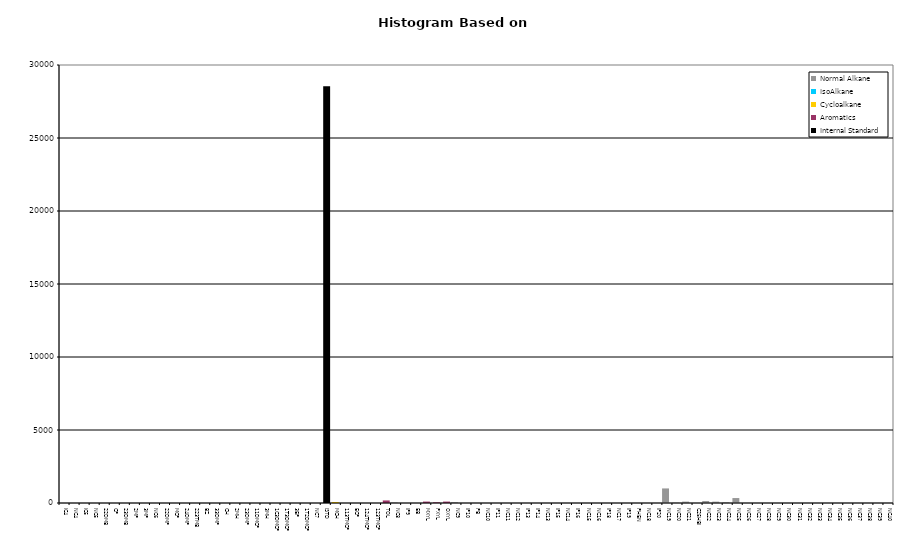
| Category | Normal Alkane | IsoAlkane | Cycloalkane | Aromatics | Internal Standard |
|---|---|---|---|---|---|
| IC4 | 0 | 0 | 0 | 0 | 0 |
| NC4 | 0 | 0 | 0 | 0 | 0 |
| IC5 | 0 | 0 | 0 | 0 | 0 |
| NC5 | 0 | 0 | 0 | 0 | 0 |
| 22DMB | 0 | 0 | 0 | 0 | 0 |
| CP | 0 | 0 | 0 | 0 | 0 |
| 23DMB | 0 | 0 | 0 | 0 | 0 |
| 2MP | 0 | 0 | 0 | 0 | 0 |
| 3MP | 0 | 0 | 0 | 0 | 0 |
| NC6 | 0 | 0 | 0 | 0 | 0 |
| 22DMP | 0 | 0 | 0 | 0 | 0 |
| MCP | 0 | 0 | 0 | 0 | 0 |
| 24DMP | 0 | 0 | 0 | 0 | 0 |
| 223TMB | 0 | 0 | 0 | 0 | 0 |
| BZ | 0 | 0 | 0 | 0 | 0 |
| 33DMP | 0 | 0 | 0 | 0 | 0 |
| CH | 0 | 0 | 0 | 0 | 0 |
| 2MH | 0 | 0 | 0 | 0 | 0 |
| 23DMP | 0 | 0 | 0 | 0 | 0 |
| 11DMCP | 0 | 0 | 0 | 0 | 0 |
| 3MH | 0 | 0 | 0 | 0 | 0 |
| 1C3DMCP | 0 | 0 | 0 | 0 | 0 |
| 1T3DMCP | 0 | 0 | 0 | 0 | 0 |
| 3EP | 0 | 0 | 0 | 0 | 0 |
| 1T2DMCP | 0 | 0 | 0 | 0 | 0 |
| NC7 | 0 | 0 | 0 | 0 | 0 |
| ISTD | 0 | 0 | 0 | 0 | 28540 |
| MCH | 0 | 0 | 67 | 0 | 0 |
| 113TMCP | 0 | 0 | 0 | 0 | 0 |
| ECP | 0 | 0 | 0 | 0 | 0 |
| 124TMCP | 0 | 0 | 0 | 0 | 0 |
| 123TMCP | 0 | 0 | 0 | 0 | 0 |
| TOL | 0 | 0 | 0 | 175 | 0 |
| NC8 | 43 | 0 | 0 | 0 | 0 |
| IP9 | 0 | 0 | 0 | 0 | 0 |
| EB | 0 | 0 | 0 | 0 | 0 |
| MXYL | 0 | 0 | 0 | 97 | 0 |
| PXYL | 0 | 0 | 0 | 49 | 0 |
| OXYL | 0 | 0 | 0 | 97 | 0 |
| NC9 | 65 | 0 | 0 | 0 | 0 |
| IP10 | 0 | 0 | 0 | 0 | 0 |
| PB | 0 | 0 | 0 | 0 | 0 |
| NC10 | 0 | 0 | 0 | 0 | 0 |
| IP11 | 0 | 0 | 0 | 0 | 0 |
| NC11 | 0 | 0 | 0 | 0 | 0 |
| NC12 | 0 | 0 | 0 | 0 | 0 |
| IP13 | 0 | 0 | 0 | 0 | 0 |
| IP14 | 0 | 0 | 0 | 0 | 0 |
| NC13 | 0 | 0 | 0 | 0 | 0 |
| IP15 | 0 | 0 | 0 | 0 | 0 |
| NC14 | 0 | 0 | 0 | 0 | 0 |
| IP16 | 0 | 0 | 0 | 0 | 0 |
| NC15 | 0 | 0 | 0 | 0 | 0 |
| NC16 | 0 | 0 | 0 | 0 | 0 |
| IP18 | 0 | 0 | 0 | 0 | 0 |
| NC17 | 0 | 0 | 0 | 0 | 0 |
| IP19 | 0 | 0 | 0 | 0 | 0 |
| PHEN | 0 | 0 | 0 | 0 | 0 |
| NC18 | 0 | 0 | 0 | 0 | 0 |
| IP20 | 0 | 0 | 0 | 0 | 0 |
| NC19 | 998 | 0 | 0 | 0 | 0 |
| NC20 | 20 | 0 | 0 | 0 | 0 |
| NC21 | 95 | 0 | 0 | 0 | 0 |
| C25HBI | 0 | 0 | 0 | 0 | 0 |
| NC22 | 135 | 0 | 0 | 0 | 0 |
| NC23 | 93 | 0 | 0 | 0 | 0 |
| NC24 | 55 | 0 | 0 | 0 | 0 |
| NC25 | 339 | 0 | 0 | 0 | 0 |
| NC26 | 0 | 0 | 0 | 0 | 0 |
| NC27 | 0 | 0 | 0 | 0 | 0 |
| NC28 | 0 | 0 | 0 | 0 | 0 |
| NC29 | 0 | 0 | 0 | 0 | 0 |
| NC30 | 0 | 0 | 0 | 0 | 0 |
| NC31 | 0 | 0 | 0 | 0 | 0 |
| NC32 | 0 | 0 | 0 | 0 | 0 |
| NC33 | 0 | 0 | 0 | 0 | 0 |
| NC34 | 0 | 0 | 0 | 0 | 0 |
| NC35 | 0 | 0 | 0 | 0 | 0 |
| NC36 | 0 | 0 | 0 | 0 | 0 |
| NC37 | 0 | 0 | 0 | 0 | 0 |
| NC38 | 0 | 0 | 0 | 0 | 0 |
| NC39 | 0 | 0 | 0 | 0 | 0 |
| NC40 | 0 | 0 | 0 | 0 | 0 |